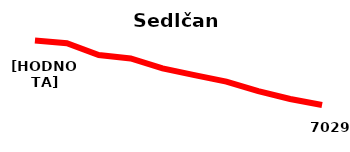
| Category | Sedlčany |
|---|---|
| 2010 | 7576 |
| 2011 | 7552 |
| 2012 | 7452 |
| 2013 | 7423 |
| 2014 | 7339 |
| 2015 | 7282 |
| 2016 | 7227 |
| 2017 | 7147 |
| 2018 | 7080 |
| 2019 | 7029 |